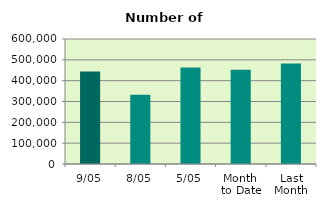
| Category | Series 0 |
|---|---|
| 9/05 | 443780 |
| 8/05 | 332660 |
| 5/05 | 463430 |
| Month 
to Date | 451954.667 |
| Last
Month | 481931.444 |